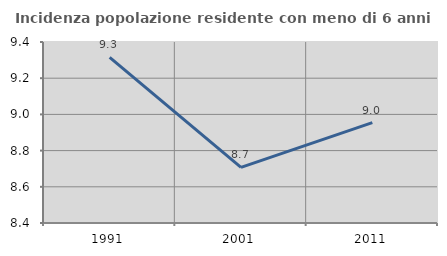
| Category | Incidenza popolazione residente con meno di 6 anni |
|---|---|
| 1991.0 | 9.315 |
| 2001.0 | 8.707 |
| 2011.0 | 8.954 |